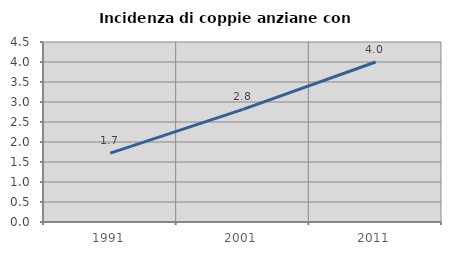
| Category | Incidenza di coppie anziane con figli |
|---|---|
| 1991.0 | 1.721 |
| 2001.0 | 2.817 |
| 2011.0 | 4 |